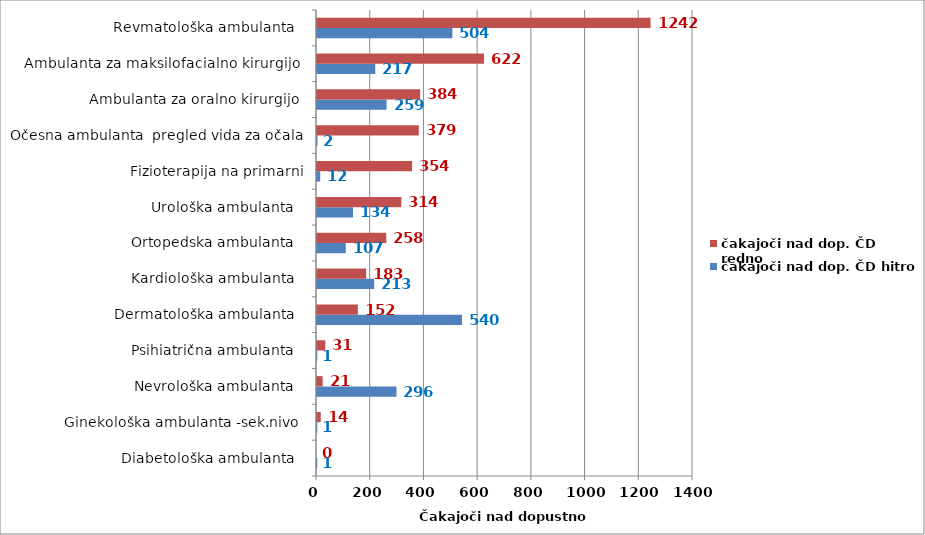
| Category | čakajoči nad dop. ČD hitro | čakajoči nad dop. ČD redno |
|---|---|---|
| Diabetološka ambulanta   | 1 | 0 |
| Ginekološka ambulanta -sek.nivo  | 1 | 14 |
| Nevrološka ambulanta   | 296 | 21 |
| Psihiatrična ambulanta   | 1 | 31 |
| Dermatološka ambulanta   | 540 | 152 |
| Kardiološka ambulanta   | 213 | 183 |
| Ortopedska ambulanta   | 107 | 258 |
| Urološka ambulanta   | 134 | 314 |
| Fizioterapija na primarni | 12 | 354 |
| Očesna ambulanta  pregled vida za očala | 2 | 379 |
| Ambulanta za oralno kirurgijo  | 259 | 384 |
| Ambulanta za maksilofacialno kirurgijo  | 217 | 622 |
| Revmatološka ambulanta   | 504 | 1242 |